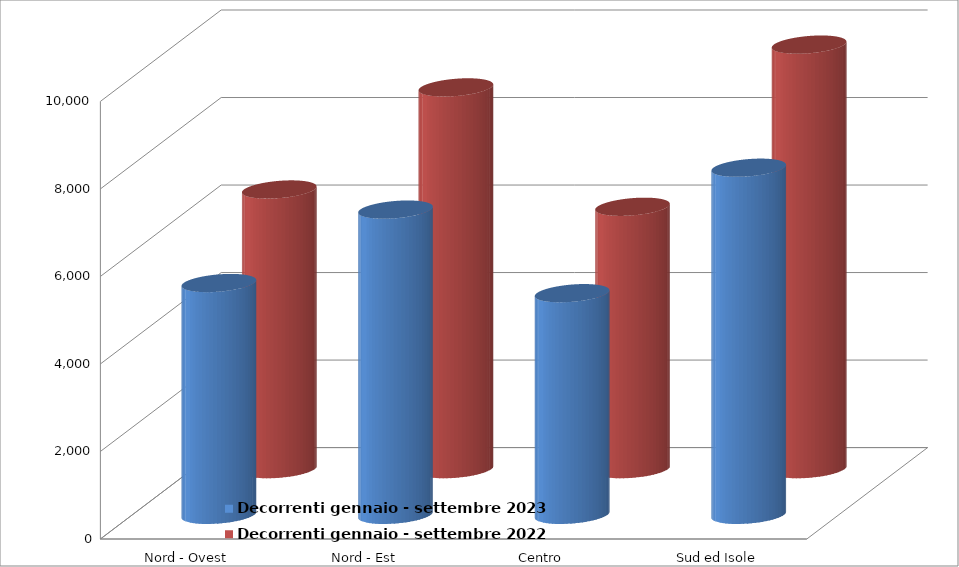
| Category | Decorrenti gennaio - settembre 2023 | Decorrenti gennaio - settembre 2022 |
|---|---|---|
| Nord - Ovest | 5298 | 6391 |
| Nord - Est | 6976 | 8724 |
| Centro | 5066 | 5996 |
| Sud ed Isole | 7933 | 9702 |